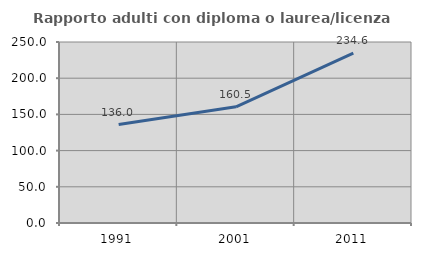
| Category | Rapporto adulti con diploma o laurea/licenza media  |
|---|---|
| 1991.0 | 135.996 |
| 2001.0 | 160.53 |
| 2011.0 | 234.591 |